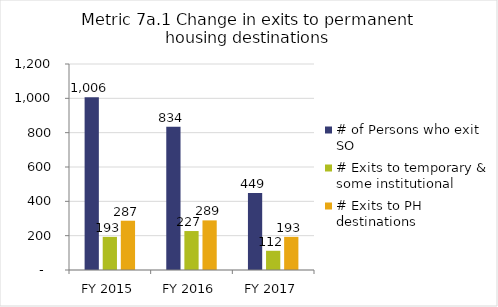
| Category | # of Persons who exit SO | # Exits to temporary & some institutional | # Exits to PH destinations |
|---|---|---|---|
| FY 2015 | 1006 | 193 | 287 |
| FY 2016 | 834 | 227 | 289 |
| FY 2017 | 449 | 112 | 193 |